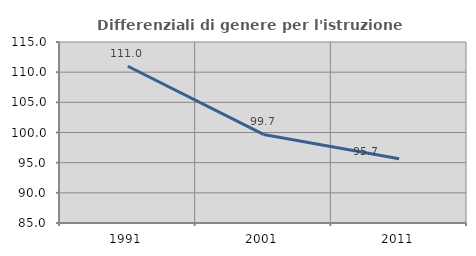
| Category | Differenziali di genere per l'istruzione superiore |
|---|---|
| 1991.0 | 110.981 |
| 2001.0 | 99.677 |
| 2011.0 | 95.663 |